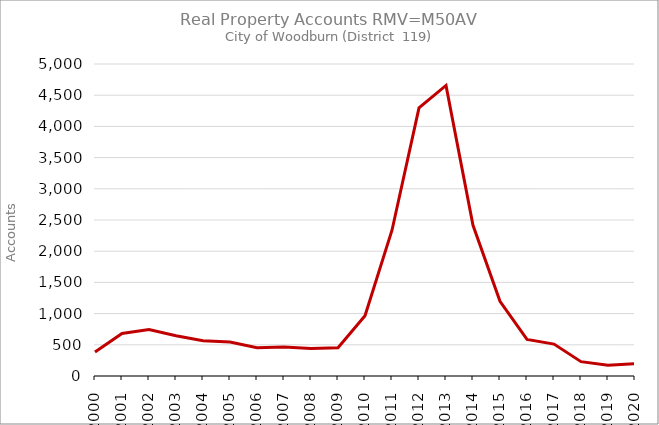
| Category | Series 0 |
|---|---|
| 2000.0 | 385 |
| 2001.0 | 682 |
| 2002.0 | 744 |
| 2003.0 | 646 |
| 2004.0 | 565 |
| 2005.0 | 543 |
| 2006.0 | 454 |
| 2007.0 | 463 |
| 2008.0 | 439 |
| 2009.0 | 453 |
| 2010.0 | 965 |
| 2011.0 | 2336 |
| 2012.0 | 4298 |
| 2013.0 | 4657 |
| 2014.0 | 2416 |
| 2015.0 | 1196 |
| 2016.0 | 586 |
| 2017.0 | 511 |
| 2018.0 | 230 |
| 2019.0 | 173 |
| 2020.0 | 198 |